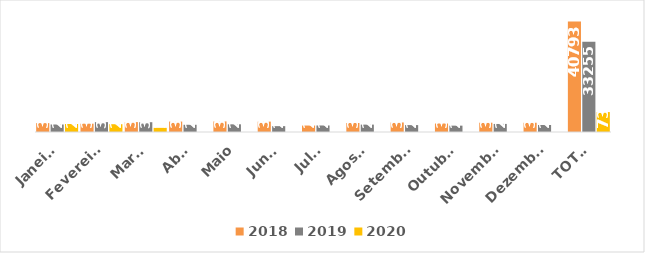
| Category | 2018 | 2019 | 2020 |
|---|---|---|---|
| Janeiro | 3274 | 2767 | 2960 |
| Fevereiro | 3064 | 3638 | 2874 |
| Março | 3655 | 3612 | 1522 |
| Abril | 3852 | 2666 | 0 |
| Maio | 3910 | 2835 | 0 |
| Junho | 3828 | 2154 | 0 |
| Julho | 2381 | 2405 | 0 |
| Agosto | 3331 | 2725 | 0 |
| Setembro | 3520 | 2548 | 0 |
| Outubro | 3133 | 2341 | 0 |
| Novembro | 3432 | 2980 | 0 |
| Dezembro | 3413 | 2584 | 0 |